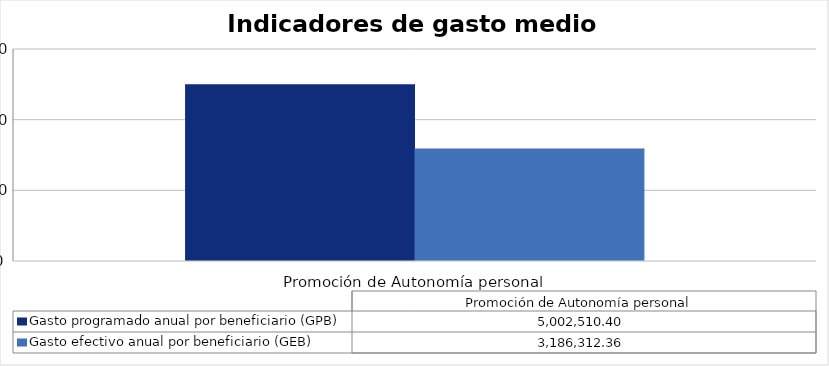
| Category | Gasto programado anual por beneficiario (GPB)  | Gasto efectivo anual por beneficiario (GEB)  |
|---|---|---|
| Promoción de Autonomía personal  | 5002510.4 | 3186312.357 |